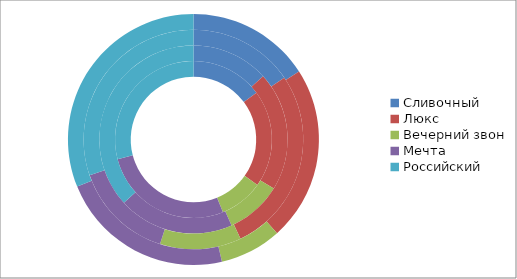
| Category | 1-й квартал | 2-й квартал | 3-й квартал | 4-й квартал |
|---|---|---|---|---|
| Сливочный | 23 | 22 | 22 | 24 |
| Люкс | 31 | 34 | 39 | 34 |
| Вечерний звон | 14 | 16 | 17 | 12 |
| Мечта | 42 | 33 | 21 | 34 |
| Российский | 45 | 61 | 43 | 47 |